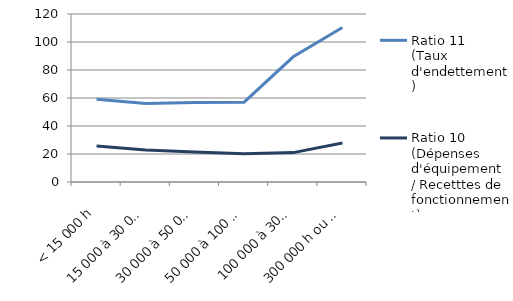
| Category | Ratio 11
(Taux d'endettement) | Ratio 10 
(Dépenses d'équipement
/ Recetttes de fonctionnement) |
|---|---|---|
| < 15 000 h | 59.022 | 25.63 |
| 15 000 à 30 000 h | 56.035 | 22.927 |
| 30 000 à 50 000 h | 56.717 | 21.498 |
| 50 000 à 100 000 h | 57.037 | 20.211 |
| 100 000 à 300 000 h | 89.413 | 20.984 |
| 300 000 h ou plus | 110.365 | 27.866 |